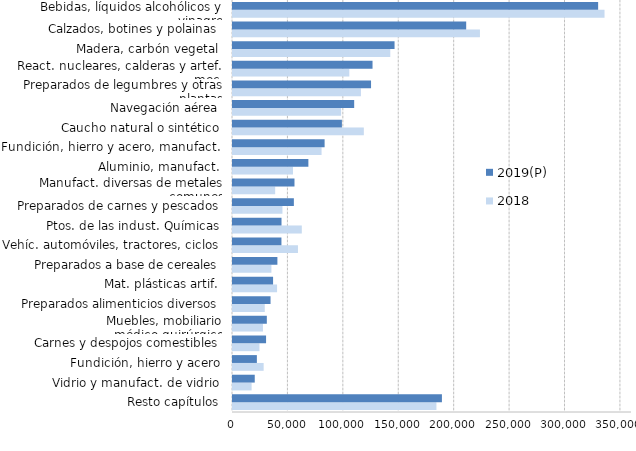
| Category | 2018 | 2019(P) |
|---|---|---|
| Resto capítulos | 183546.285 | 188498.734 |
| Vidrio y manufact. de vidrio | 16801.957 | 19625.959 |
| Fundición, hierro y acero | 27654.897 | 21535.089 |
| Carnes y despojos comestibles | 23878.817 | 29841.009 |
| Muebles, mobiliario médico-quirúrgico | 27001.406 | 30516.039 |
| Preparados alimenticios diversos | 28643.333 | 33871.268 |
| Mat. plásticas artif. | 39772.713 | 36161.428 |
| Preparados a base de cereales | 34653.093 | 40054.406 |
| Vehíc. automóviles, tractores, ciclos | 58617.521 | 43713.248 |
| Ptos. de las indust. Químicas | 62081.089 | 43767.4 |
| Preparados de carnes y pescados | 44613.755 | 54910.882 |
| Manufact. diversas de metales comunes | 38051.368 | 55471.949 |
| Aluminio, manufact. | 54112.074 | 68008.409 |
| Fundición, hierro y acero, manufact. | 79905.549 | 82657.392 |
| Caucho natural o sintético | 118036.624 | 98259.35 |
| Navegación aérea | 97561.865 | 109334.894 |
| Preparados de legumbres y otras plantas | 115422.17 | 124553.654 |
| React. nucleares, calderas y artef. mec. | 104954.276 | 125890.899 |
| Madera, carbón vegetal | 141907.114 | 145760.744 |
| Calzados, botines y polainas | 222811.122 | 210399.29 |
| Bebidas, líquidos alcohólicos y vinagre | 335220.689 | 329446.794 |